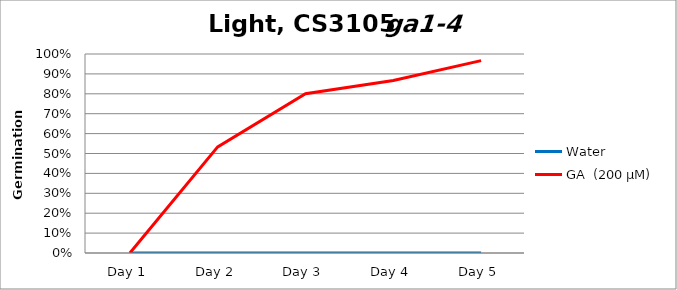
| Category | Water | GA  (200 µM)  |
|---|---|---|
| Day 1 | 0 | 0 |
| Day 2 | 0 | 0.533 |
| Day 3 | 0 | 0.8 |
| Day 4 | 0 | 0.867 |
| Day 5 | 0 | 0.967 |